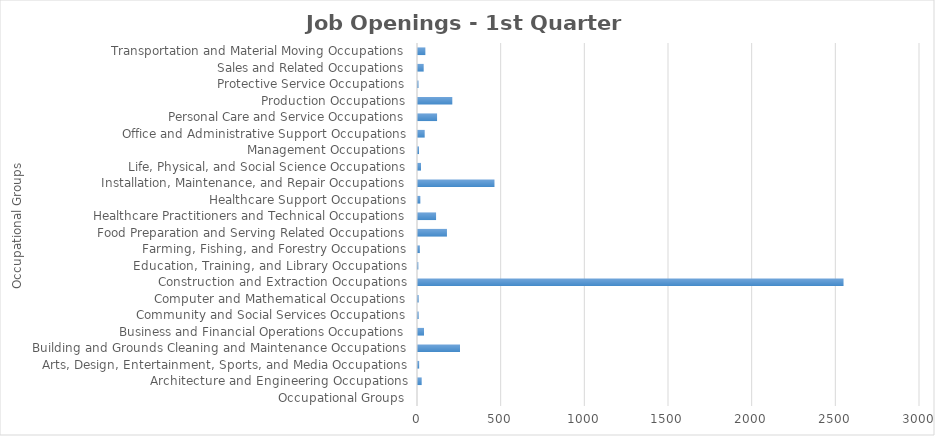
| Category | Series1 |
|---|---|
| Occupational Groups | 0 |
| Architecture and Engineering Occupations | 22 |
| Arts, Design, Entertainment, Sports, and Media Occupations | 7 |
| Building and Grounds Cleaning and Maintenance Occupations | 251 |
| Business and Financial Operations Occupations | 36 |
| Community and Social Services Occupations | 4 |
| Computer and Mathematical Occupations | 4 |
| Construction and Extraction Occupations | 2543 |
| Education, Training, and Library Occupations | 2 |
| Farming, Fishing, and Forestry Occupations | 11 |
| Food Preparation and Serving Related Occupations | 173 |
| Healthcare Practitioners and Technical Occupations | 108 |
| Healthcare Support Occupations | 14 |
| Installation, Maintenance, and Repair Occupations | 457 |
| Life, Physical, and Social Science Occupations | 18 |
| Management Occupations | 6 |
| Office and Administrative Support Occupations | 40 |
| Personal Care and Service Occupations | 114 |
| Production Occupations | 205 |
| Protective Service Occupations | 3 |
| Sales and Related Occupations | 34 |
| Transportation and Material Moving Occupations | 44 |